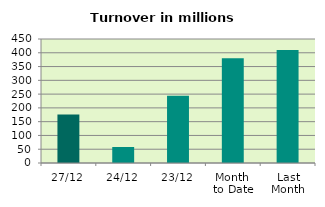
| Category | Series 0 |
|---|---|
| 27/12 | 176.249 |
| 24/12 | 57.969 |
| 23/12 | 243.788 |
| Month 
to Date | 380.417 |
| Last
Month | 410.338 |